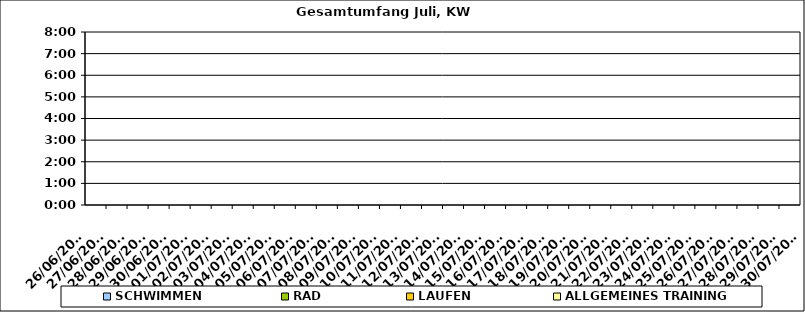
| Category | SCHWIMMEN | RAD | LAUFEN | ALLGEMEINES TRAINING |
|---|---|---|---|---|
| 26/06/2023 |  |  |  | 0 |
| 27/06/2023 |  |  |  | 0 |
| 28/06/2023 |  |  |  | 0 |
| 29/06/2023 |  |  |  | 0 |
| 30/06/2023 |  |  |  | 0 |
| 01/07/2023 |  |  |  | 0 |
| 02/07/2023 |  |  |  | 0 |
| 03/07/2023 |  |  |  | 0 |
| 04/07/2023 |  |  |  | 0 |
| 05/07/2023 |  |  |  | 0 |
| 06/07/2023 |  |  |  | 0 |
| 07/07/2023 |  |  |  | 0 |
| 08/07/2023 |  |  |  | 0 |
| 09/07/2023 |  |  |  | 0 |
| 10/07/2023 |  |  |  | 0 |
| 11/07/2023 |  |  |  | 0 |
| 12/07/2023 |  |  |  | 0 |
| 13/07/2023 |  |  |  | 0 |
| 14/07/2023 |  |  |  | 0 |
| 15/07/2023 |  |  |  | 0 |
| 16/07/2023 |  |  |  | 0 |
| 17/07/2023 |  |  |  | 0 |
| 18/07/2023 |  |  |  | 0 |
| 19/07/2023 |  |  |  | 0 |
| 20/07/2023 |  |  |  | 0 |
| 21/07/2023 |  |  |  | 0 |
| 22/07/2023 |  |  |  | 0 |
| 23/07/2023 |  |  |  | 0 |
| 24/07/2023 |  |  |  | 0 |
| 25/07/2023 |  |  |  | 0 |
| 26/07/2023 |  |  |  | 0 |
| 27/07/2023 |  |  |  | 0 |
| 28/07/2023 |  |  |  | 0 |
| 29/07/2023 |  |  |  | 0 |
| 30/07/2023 |  |  |  | 0 |